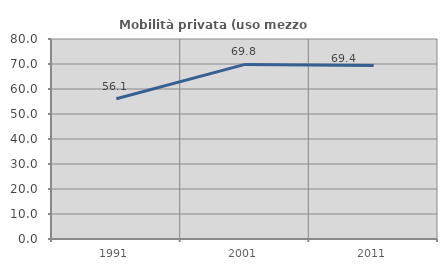
| Category | Mobilità privata (uso mezzo privato) |
|---|---|
| 1991.0 | 56.116 |
| 2001.0 | 69.832 |
| 2011.0 | 69.387 |